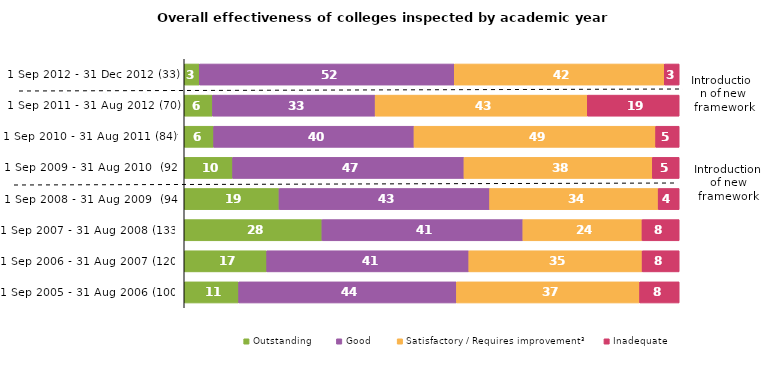
| Category | Outstanding | Good | Satisfactory / Requires improvement³ | Inadequate |
|---|---|---|---|---|
| 1 Sep 2012 - 31 Dec 2012 (33) | 3.03 | 51.515 | 42.424 | 3.03 |
| 1 Sep 2011 - 31 Aug 2012 (70) | 5.714 | 32.857 | 42.857 | 18.571 |
| 1 Sep 2010 - 31 Aug 2011 (84)⁴ | 5.952 | 40.476 | 48.81 | 4.762 |
| 1 Sep 2009 - 31 Aug 2010  (92) | 9.783 | 46.739 | 38.043 | 5.435 |
| 1 Sep 2008 - 31 Aug 2009  (94) | 19.149 | 42.553 | 34.043 | 4.255 |
| 1 Sep 2007 - 31 Aug 2008 (133) | 27.82 | 40.602 | 24.06 | 7.519 |
| 1 Sep 2006 - 31 Aug 2007 (120) | 16.667 | 40.833 | 35 | 7.5 |
| 1 Sep 2005 - 31 Aug 2006 (100) | 11 | 44 | 37 | 8 |